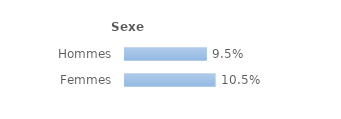
| Category | Series 0 |
|---|---|
| Hommes | 0.095 |
| Femmes | 0.105 |